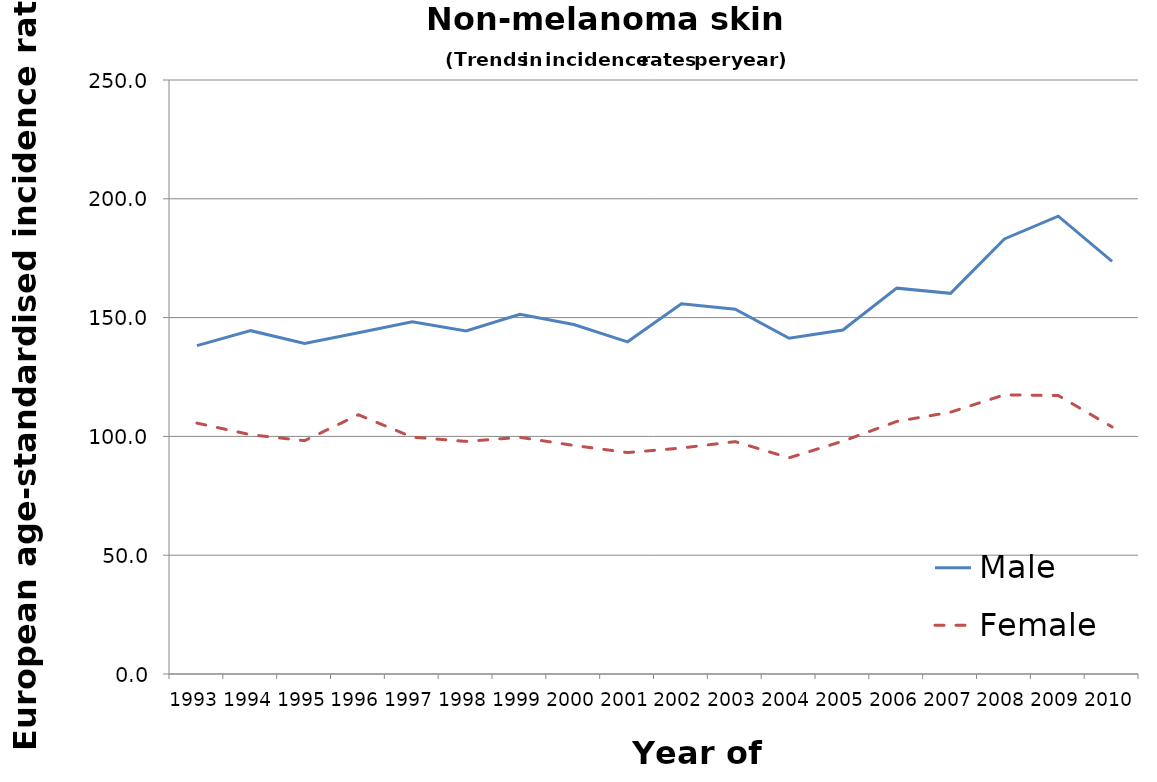
| Category | Male | Female |
|---|---|---|
| 1993.0 | 138.2 | 105.6 |
| 1994.0 | 144.5 | 100.7 |
| 1995.0 | 139.1 | 98.2 |
| 1996.0 | 143.6 | 109.1 |
| 1997.0 | 148.2 | 99.7 |
| 1998.0 | 144.4 | 97.9 |
| 1999.0 | 151.4 | 99.6 |
| 2000.0 | 147.1 | 96.2 |
| 2001.0 | 139.8 | 93.2 |
| 2002.0 | 155.8 | 95.1 |
| 2003.0 | 153.5 | 97.8 |
| 2004.0 | 141.3 | 91 |
| 2005.0 | 144.8 | 98 |
| 2006.0 | 162.4 | 106.3 |
| 2007.0 | 160.2 | 110.2 |
| 2008.0 | 183.1 | 117.5 |
| 2009.0 | 192.7 | 117.2 |
| 2010.0 | 173.7 | 104 |